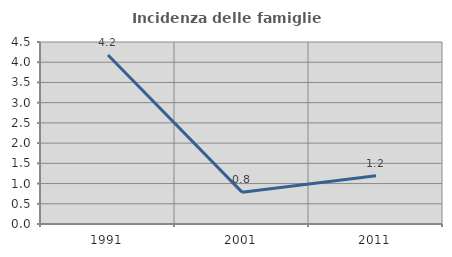
| Category | Incidenza delle famiglie numerose |
|---|---|
| 1991.0 | 4.179 |
| 2001.0 | 0.787 |
| 2011.0 | 1.193 |